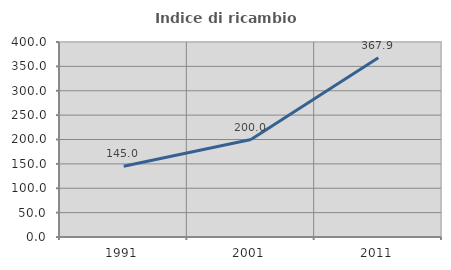
| Category | Indice di ricambio occupazionale  |
|---|---|
| 1991.0 | 145 |
| 2001.0 | 200 |
| 2011.0 | 367.857 |